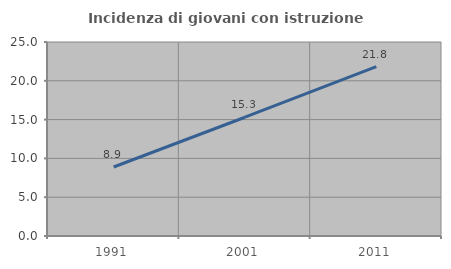
| Category | Incidenza di giovani con istruzione universitaria |
|---|---|
| 1991.0 | 8.889 |
| 2001.0 | 15.306 |
| 2011.0 | 21.839 |